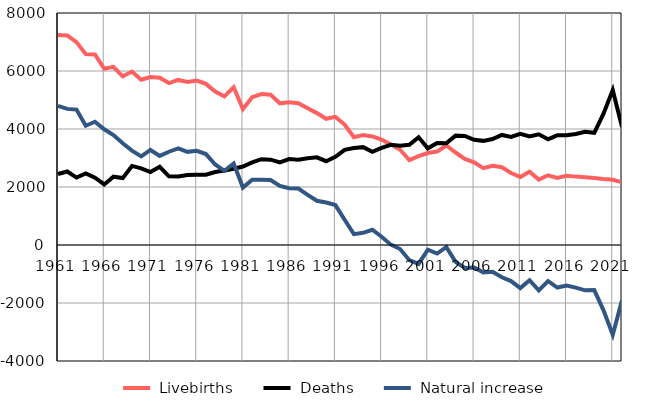
| Category |  Livebirths |  Deaths |  Natural increase |
|---|---|---|---|
| 1961.0 | 7244 | 2448 | 4796 |
| 1962.0 | 7228 | 2534 | 4694 |
| 1963.0 | 6995 | 2325 | 4670 |
| 1964.0 | 6582 | 2469 | 4113 |
| 1965.0 | 6571 | 2322 | 4249 |
| 1966.0 | 6076 | 2087 | 3989 |
| 1967.0 | 6144 | 2355 | 3789 |
| 1968.0 | 5815 | 2307 | 3508 |
| 1969.0 | 5981 | 2727 | 3254 |
| 1970.0 | 5699 | 2642 | 3057 |
| 1971.0 | 5793 | 2516 | 3277 |
| 1972.0 | 5768 | 2696 | 3072 |
| 1973.0 | 5585 | 2369 | 3216 |
| 1974.0 | 5692 | 2362 | 3330 |
| 1975.0 | 5623 | 2411 | 3212 |
| 1976.0 | 5668 | 2421 | 3247 |
| 1977.0 | 5557 | 2421 | 3136 |
| 1978.0 | 5292 | 2515 | 2777 |
| 1979.0 | 5127 | 2569 | 2558 |
| 1980.0 | 5441 | 2630 | 2811 |
| 1981.0 | 4685 | 2705 | 1980 |
| 1982.0 | 5097 | 2846 | 2251 |
| 1983.0 | 5206 | 2960 | 2246 |
| 1984.0 | 5180 | 2942 | 2238 |
| 1985.0 | 4885 | 2848 | 2037 |
| 1986.0 | 4918 | 2963 | 1955 |
| 1987.0 | 4891 | 2944 | 1947 |
| 1988.0 | 4716 | 2990 | 1726 |
| 1989.0 | 4548 | 3023 | 1525 |
| 1990.0 | 4353 | 2890 | 1463 |
| 1991.0 | 4419 | 3043 | 1376 |
| 1992.0 | 4154 | 3283 | 871 |
| 1993.0 | 3719 | 3344 | 375 |
| 1994.0 | 3795 | 3374 | 421 |
| 1995.0 | 3742 | 3216 | 526 |
| 1996.0 | 3631 | 3347 | 284 |
| 1997.0 | 3468 | 3456 | 12 |
| 1998.0 | 3286 | 3426 | -140 |
| 1999.0 | 2930 | 3454 | -524 |
| 2000.0 | 3064 | 3717 | -653 |
| 2001.0 | 3171 | 3334 | -163 |
| 2002.0 | 3221 | 3517 | -296 |
| 2003.0 | 3431 | 3507 | -76 |
| 2004.0 | 3189 | 3771 | -582 |
| 2005.0 | 2970 | 3760 | -790 |
| 2006.0 | 2848 | 3626 | -778 |
| 2007.0 | 2648 | 3591 | -943 |
| 2008.0 | 2732 | 3656 | -924 |
| 2009.0 | 2681 | 3795 | -1114 |
| 2010.0 | 2481 | 3724 | -1243 |
| 2011.0 | 2348 | 3835 | -1487 |
| 2012.0 | 2526 | 3740 | -1214 |
| 2013.0 | 2256 | 3818 | -1562 |
| 2014.0 | 2404 | 3645 | -1241 |
| 2015.0 | 2314 | 3782 | -1468 |
| 2016.0 | 2388 | 3786 | -1398 |
| 2017.0 | 2358 | 3827 | -1469 |
| 2018.0 | 2337 | 3901 | -1564 |
| 2019.0 | 2313 | 3869 | -1556 |
| 2020.0 | 2274 | 4528 | -2254 |
| 2021.0 | 2247 | 5340 | -3093 |
| 2022.0 | 2163 | 4073 | -1910 |